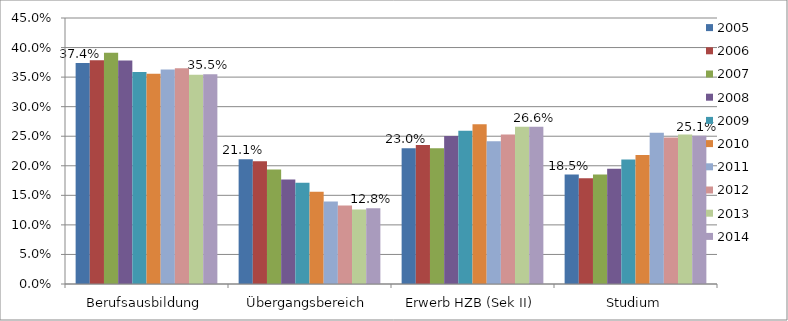
| Category | 2005 | 2006 | 2007 | 2008 | 2009 | 2010 | 2011 | 2012 | 2013 | 2014 |
|---|---|---|---|---|---|---|---|---|---|---|
| Berufsausbildung | 0.374 | 0.378 | 0.391 | 0.378 | 0.359 | 0.355 | 0.363 | 0.365 | 0.354 | 0.355 |
| Übergangsbereich | 0.211 | 0.208 | 0.194 | 0.177 | 0.171 | 0.156 | 0.14 | 0.133 | 0.126 | 0.128 |
| Erwerb HZB (Sek II) | 0.23 | 0.235 | 0.23 | 0.25 | 0.259 | 0.27 | 0.241 | 0.253 | 0.266 | 0.266 |
| Studium | 0.185 | 0.179 | 0.185 | 0.195 | 0.211 | 0.218 | 0.256 | 0.248 | 0.253 | 0.251 |